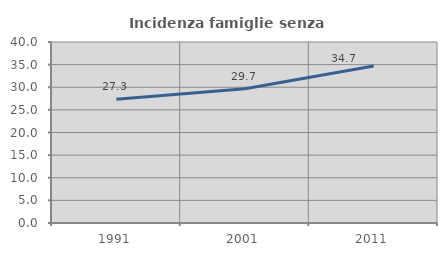
| Category | Incidenza famiglie senza nuclei |
|---|---|
| 1991.0 | 27.331 |
| 2001.0 | 29.672 |
| 2011.0 | 34.713 |